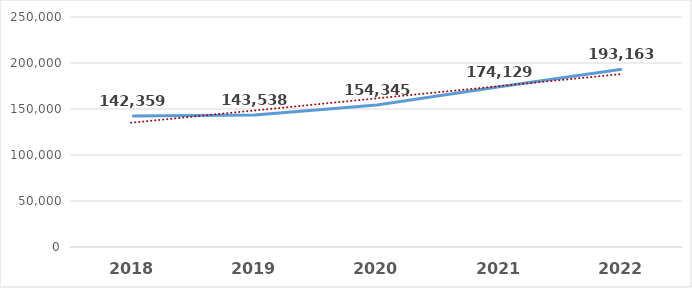
| Category | Series 0 |
|---|---|
| 2018.0 | 142359 |
| 2019.0 | 143538 |
| 2020.0 | 154345 |
| 2021.0 | 174129.189 |
| 2022.0 | 193162.835 |